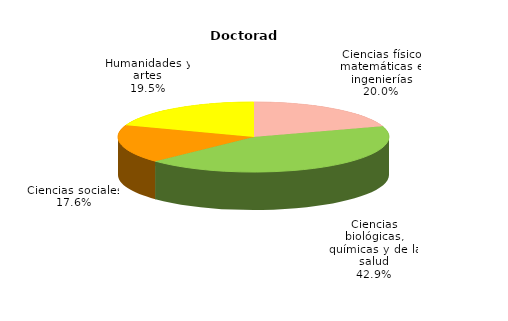
| Category | Series 0 |
|---|---|
| Ciencias físico matemáticas e ingenierías | 1094 |
| Ciencias biológicas, químicas y de la salud | 2340 |
| Ciencias sociales | 962 |
| Humanidades y artes | 1065 |